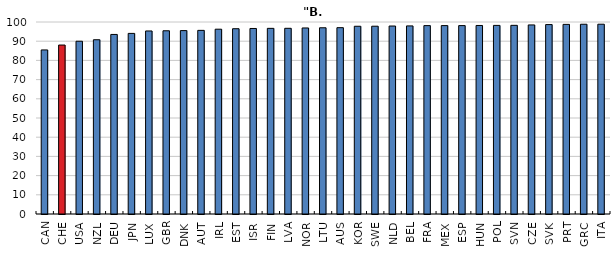
| Category | Series 0 |
|---|---|
| CAN | 85.45 |
| CHE | 88.003 |
| USA | 89.986 |
| NZL | 90.757 |
| DEU | 93.516 |
| JPN | 94.067 |
| LUX | 95.335 |
| GBR | 95.428 |
| DNK | 95.519 |
| AUT | 95.645 |
| IRL | 96.25 |
| EST | 96.501 |
| ISR | 96.625 |
| FIN | 96.69 |
| LVA | 96.719 |
| NOR | 96.897 |
| LTU | 96.99 |
| AUS | 97.054 |
| KOR | 97.786 |
| SWE | 97.805 |
| NLD | 97.901 |
| BEL | 97.973 |
| FRA | 98.116 |
| MEX | 98.122 |
| ESP | 98.122 |
| HUN | 98.19 |
| POL | 98.232 |
| SVN | 98.259 |
| CZE | 98.475 |
| SVK | 98.663 |
| PRT | 98.755 |
| GRC | 98.83 |
| ITA | 98.85 |